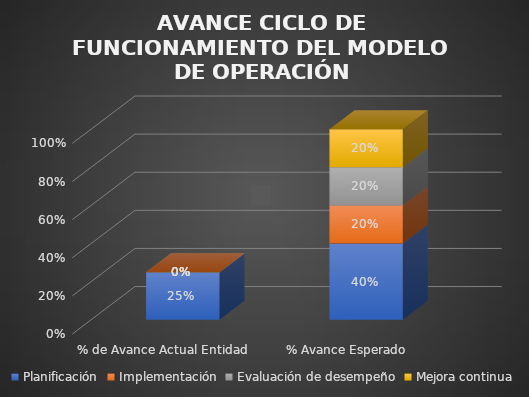
| Category | Planificación | Implementación | Evaluación de desempeño | Mejora continua |
|---|---|---|---|---|
| % de Avance Actual Entidad | 0.25 | 0 | 0 | 0 |
| % Avance Esperado | 0.4 | 0.2 | 0.2 | 0.2 |